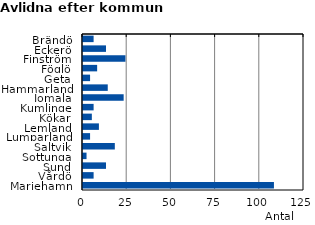
| Category | Series 0 |
|---|---|
| Brändö | 6 |
| Eckerö | 13 |
| Finström | 24 |
| Föglö | 8 |
| Geta | 4 |
| Hammarland | 14 |
| Jomala | 23 |
| Kumlinge | 6 |
| Kökar | 5 |
| Lemland | 9 |
| Lumparland | 4 |
| Saltvik | 18 |
| Sottunga | 2 |
| Sund | 13 |
| Vårdö | 6 |
| Mariehamn | 108 |